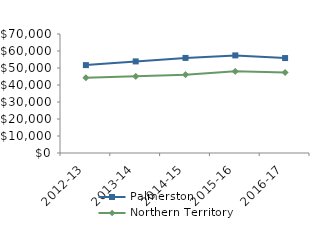
| Category | Palmerston | Northern Territory |
|---|---|---|
| 2012-13 | 51694.55 | 44232.02 |
| 2013-14 | 53880.53 | 45075.51 |
| 2014-15 | 55936 | 46083.65 |
| 2015-16 | 57425.2 | 48046.27 |
| 2016-17 | 55851.02 | 47367.05 |